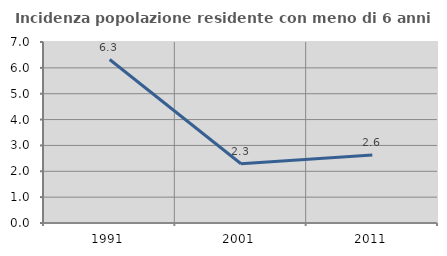
| Category | Incidenza popolazione residente con meno di 6 anni |
|---|---|
| 1991.0 | 6.322 |
| 2001.0 | 2.29 |
| 2011.0 | 2.632 |